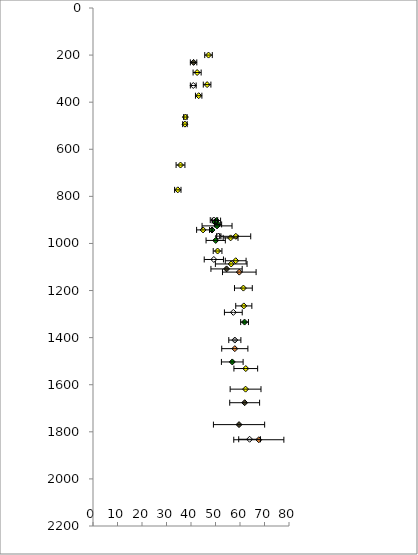
| Category | Anorthosite |
|---|---|
| 40.92551556738721 | 329.15 |
| 51.11394764617654 | 968.998 |
| 49.3227615164259 | 1068.026 |
| 57.2769896711163 | 1292.667 |
| 63.91545190738126 | 1831.567 |
| 41.05068718368239 | 230.944 |
| 54.51722697540328 | 1108.131 |
| 61.9055398105958 | 1676.356 |
| 59.60735496783433 | 1769.446 |
| 59.71331117555763 | 1121.65 |
| 57.87996765017056 | 1446.782 |
| 67.67819257687671 | 1833.668 |
| 57.88786535447331 | 1410.331 |
| 47.1527871535059 | 199.884 |
| 42.49698307799095 | 274.064 |
| 46.57057885557235 | 325.314 |
| 43.13245174536022 | 372.544 |
| 37.70994067429182 | 463.168 |
| 37.52806979408262 | 493.315 |
| 35.71798412319838 | 666.888 |
| 34.61002663181048 | 772.311 |
| 49.37814365688177 | 900.939 |
| 44.9296502682865 | 942.413 |
| 58.30751586343992 | 969.729 |
| 56.16070372838988 | 976.306 |
| 50.85108982904556 | 1032.124 |
| 58.2407522272922 | 1073.416 |
| 56.41360171668044 | 1087.119 |
| 61.3849021973129 | 1189.528 |
| 61.54794380093487 | 1265.26 |
| 62.36189242694946 | 1531.285 |
| 62.27343969636821 | 1618.803 |
| 50.35419050052386 | 902.875 |
| 49.81369993883931 | 909.069 |
| 51.02065529292912 | 919.118 |
| 50.62887578516366 | 925.376 |
| 48.57389021369297 | 942.779 |
| 50.0817123467347 | 987.177 |
| 61.85727772566738 | 1333.868 |
| 56.84413995660567 | 1503.239 |